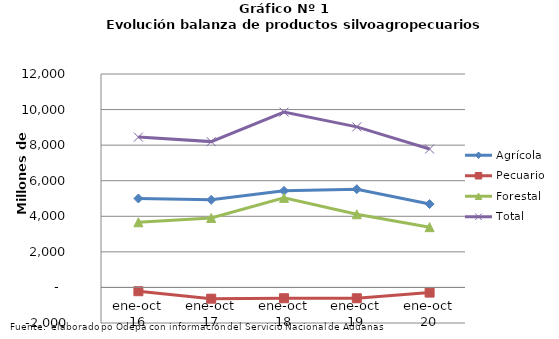
| Category | Agrícola | Pecuario | Forestal | Total |
|---|---|---|---|---|
| ene-oct 16 | 5001157 | -212897 | 3662865 | 8451125 |
| ene-oct 17 | 4925796 | -633252 | 3905440 | 8197984 |
| ene-oct 18 | 5428902 | -607790 | 5034391 | 9855503 |
| ene-oct 19 | 5523824 | -609688 | 4112056 | 9026192 |
| ene-oct 20 | 4686186 | -290807 | 3388604 | 7783983 |